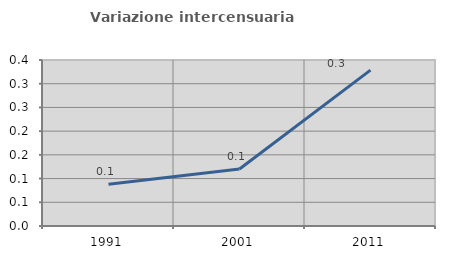
| Category | Variazione intercensuaria annua |
|---|---|
| 1991.0 | 0.088 |
| 2001.0 | 0.12 |
| 2011.0 | 0.329 |